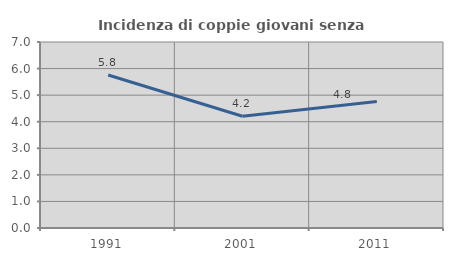
| Category | Incidenza di coppie giovani senza figli |
|---|---|
| 1991.0 | 5.759 |
| 2001.0 | 4.206 |
| 2011.0 | 4.762 |